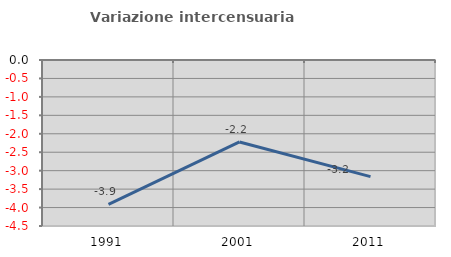
| Category | Variazione intercensuaria annua |
|---|---|
| 1991.0 | -3.915 |
| 2001.0 | -2.222 |
| 2011.0 | -3.162 |